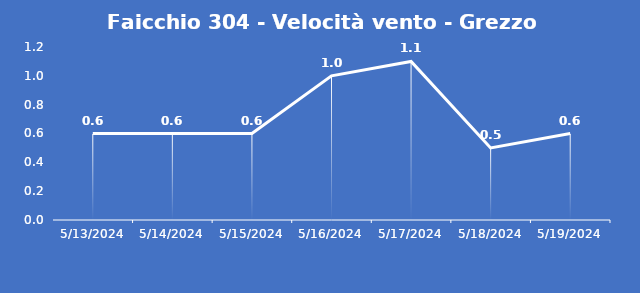
| Category | Faicchio 304 - Velocità vento - Grezzo (m/s) |
|---|---|
| 5/13/24 | 0.6 |
| 5/14/24 | 0.6 |
| 5/15/24 | 0.6 |
| 5/16/24 | 1 |
| 5/17/24 | 1.1 |
| 5/18/24 | 0.5 |
| 5/19/24 | 0.6 |